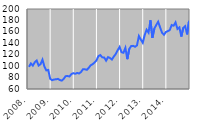
| Category | Series 0 |
|---|---|
| 2008. | 98.771 |
| 2  | 104.681 |
| 3  | 100.936 |
| 4  | 106.721 |
| 5  | 109.864 |
| 6  | 101.053 |
| 7  | 103.411 |
| 8  | 111.343 |
| 9  | 99.469 |
| 10  | 92.603 |
| 11  | 93.321 |
| 12  | 77.827 |
| 2009. | 75.386 |
| 2  | 76.71 |
| 3  | 76.933 |
| 4  | 77.768 |
| 5  | 75.758 |
| 6  | 74.684 |
| 7  | 77.626 |
| 8  | 82.444 |
| 9  | 82.711 |
| 10  | 81.892 |
| 11  | 86.129 |
| 12  | 87.727 |
| 2010. | 86.584 |
| 2  | 88.111 |
| 3  | 87.177 |
| 4  | 89.75 |
| 5  | 94.631 |
| 6  | 94.399 |
| 7  | 93.563 |
| 8  | 97.037 |
| 9  | 101.46 |
| 10  | 103.393 |
| 11  | 106.37 |
| 12  | 110.023 |
| 2011. | 117.565 |
| 2  | 119.394 |
| 3  | 115.41 |
| 4  | 115.116 |
| 5  | 109.583 |
| 6  | 115.85 |
| 7  | 114.229 |
| 8  | 111.538 |
| 9  | 116.877 |
| 10  | 121.202 |
| 11  | 127.854 |
| 12  | 133.608 |
| 2012. | 124.327 |
| 2  | 123.435 |
| 3  | 131.949 |
| 4  | 112.153 |
| 5  | 130.185 |
| 6  | 135.205 |
| 7  | 135.497 |
| 8  | 133.948 |
| 9  | 136.225 |
| 10  | 152.669 |
| 11  | 146.435 |
| 12  | 140.918 |
| 2013. | 154.398 |
| 2  | 163.794 |
| 3  | 158.734 |
| 4  | 180.313 |
| 5  | 149.486 |
| 6  | 165.575 |
| 7  | 172.051 |
| 8  | 177.712 |
| 9  | 167.73 |
| 10  | 158.491 |
| 11  | 154.886 |
| 12  | 159.784 |
| 2014. | 161.314 |
| 2  | 163.143 |
| 3  | 171.935 |
| 4  | 170.755 |
| 5  | 176.537 |
| 6  | 165.013 |
| 7  | 167.829 |
| 8  | 151.798 |
| 9  | 166.942 |
| 10  | 169.948 |
| 11  | 155.534 |
| 12  | 179.171 |